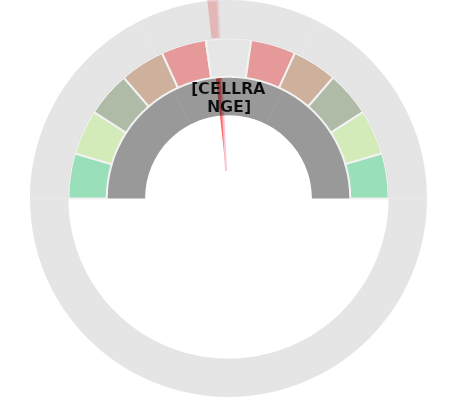
| Category | Pointer |
|---|---|
| 0 | 47.222 |
| 1 | 2 |
| 2 | 153.778 |
| 3 | 0 |